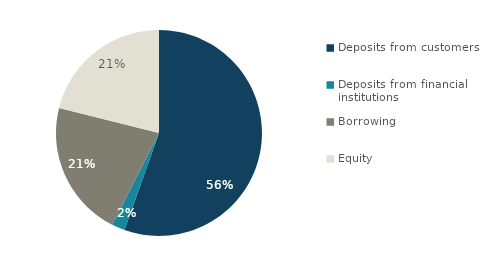
| Category | Series 0 |
|---|---|
| Deposits from customers | 627954 |
| Deposits from financial institutions | 23486 |
| Borrowing | 242274 |
| Equity | 238944 |